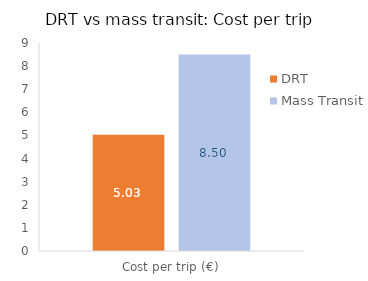
| Category | DRT | Mass Transit |
|---|---|---|
| 0 | 5.035 | 8.504 |